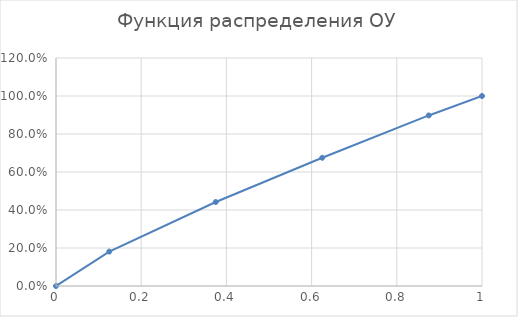
| Category | Профиль ОУ |
|---|---|
| 0.0 | 0 |
| 0.125 | 0.181 |
| 0.375 | 0.442 |
| 0.625 | 0.675 |
| 0.875 | 0.898 |
| 1.0 | 1 |